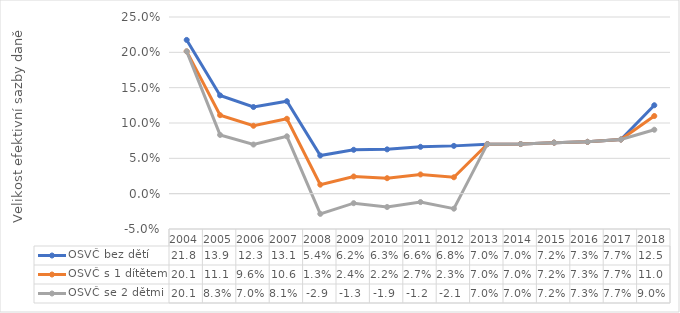
| Category | OSVČ bez dětí | OSVČ s 1 dítětem | OSVČ se 2 dětmi |
|---|---|---|---|
| 2004.0 | 0.218 | 0.201 | 0.201 |
| 2005.0 | 0.139 | 0.111 | 0.083 |
| 2006.0 | 0.123 | 0.096 | 0.07 |
| 2007.0 | 0.131 | 0.106 | 0.081 |
| 2008.0 | 0.054 | 0.013 | -0.029 |
| 2009.0 | 0.062 | 0.024 | -0.013 |
| 2010.0 | 0.063 | 0.022 | -0.019 |
| 2011.0 | 0.066 | 0.027 | -0.012 |
| 2012.0 | 0.068 | 0.023 | -0.021 |
| 2013.0 | 0.07 | 0.07 | 0.07 |
| 2014.0 | 0.07 | 0.07 | 0.07 |
| 2015.0 | 0.072 | 0.072 | 0.072 |
| 2016.0 | 0.073 | 0.073 | 0.073 |
| 2017.0 | 0.077 | 0.077 | 0.077 |
| 2018.0 | 0.125 | 0.11 | 0.09 |